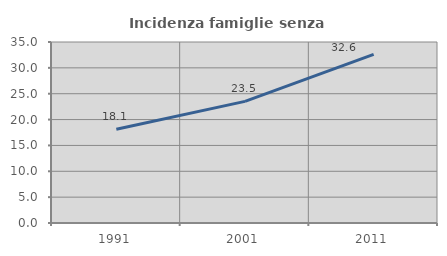
| Category | Incidenza famiglie senza nuclei |
|---|---|
| 1991.0 | 18.14 |
| 2001.0 | 23.517 |
| 2011.0 | 32.595 |